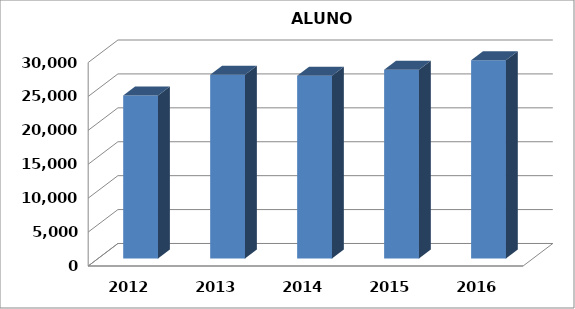
| Category | Series 0 |
|---|---|
| 2012.0 | 24045.827 |
| 2013.0 | 27083.371 |
| 2014.0 | 26959.712 |
| 2015.0 | 27845.072 |
| 2016.0 | 29244.542 |